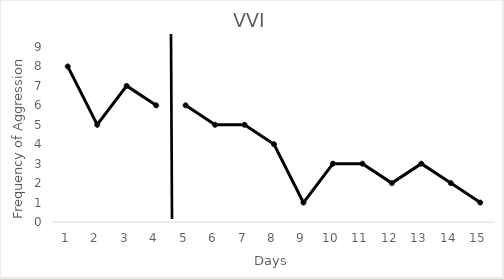
| Category | Series 0 |
|---|---|
| 0 | 8 |
| 1 | 5 |
| 2 | 7 |
| 3 | 6 |
| 4 | 6 |
| 5 | 5 |
| 6 | 5 |
| 7 | 4 |
| 8 | 1 |
| 9 | 3 |
| 10 | 3 |
| 11 | 2 |
| 12 | 3 |
| 13 | 2 |
| 14 | 1 |